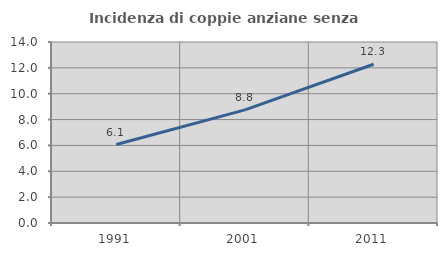
| Category | Incidenza di coppie anziane senza figli  |
|---|---|
| 1991.0 | 6.071 |
| 2001.0 | 8.75 |
| 2011.0 | 12.278 |